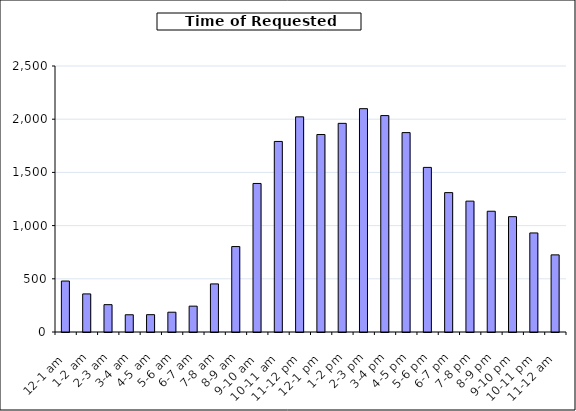
| Category | Series 0 |
|---|---|
| 12-1 am | 479 |
| 1-2 am | 358 |
| 2-3 am | 257 |
| 3-4 am | 162 |
| 4-5 am | 163 |
| 5-6 am | 186 |
| 6-7 am | 243 |
| 7-8 am | 452 |
| 8-9 am | 803 |
| 9-10 am | 1396 |
| 10-11 am | 1791 |
| 11-12 pm | 2022 |
| 12-1 pm | 1856 |
| 1-2 pm | 1961 |
| 2-3 pm | 2099 |
| 3-4 pm | 2034 |
| 4-5 pm | 1874 |
| 5-6 pm | 1547 |
| 6-7 pm | 1310 |
| 7-8 pm | 1230 |
| 8-9 pm | 1135 |
| 9-10 pm | 1084 |
| 10-11 pm | 931 |
| 11-12 am | 725 |